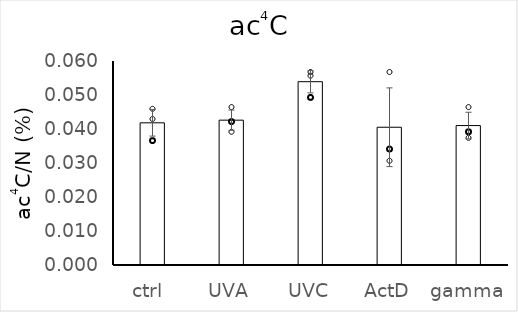
| Category | Series 0 |
|---|---|
| ctrl  | 0.042 |
| UVA | 0.043 |
| UVC | 0.054 |
| ActD | 0.041 |
| gamma | 0.041 |